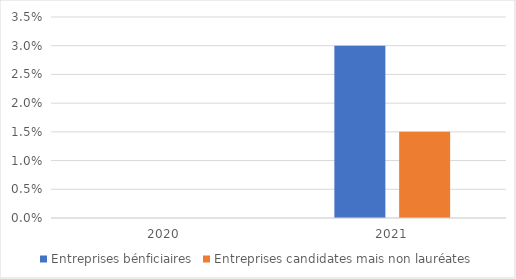
| Category | Entreprises bénficiaires | Entreprises candidates mais non lauréates |
|---|---|---|
| 2020.0 | 0 | 0 |
| 2021.0 | 0.03 | 0.015 |